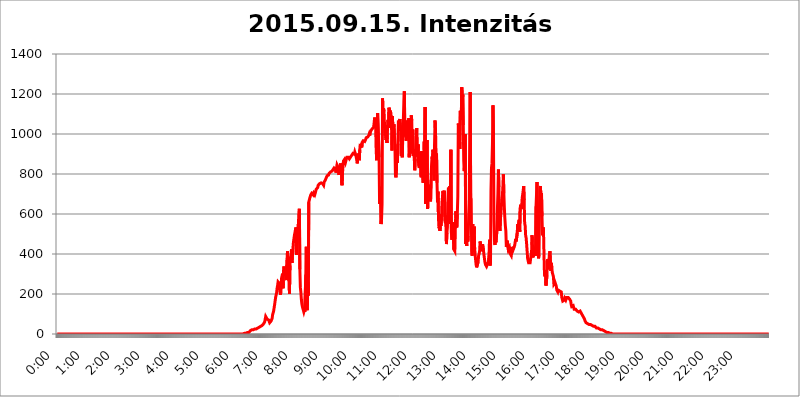
| Category | 2015.09.15. Intenzitás [W/m^2] |
|---|---|
| 0.0 | 0 |
| 0.0006944444444444445 | 0 |
| 0.001388888888888889 | 0 |
| 0.0020833333333333333 | 0 |
| 0.002777777777777778 | 0 |
| 0.003472222222222222 | 0 |
| 0.004166666666666667 | 0 |
| 0.004861111111111111 | 0 |
| 0.005555555555555556 | 0 |
| 0.0062499999999999995 | 0 |
| 0.006944444444444444 | 0 |
| 0.007638888888888889 | 0 |
| 0.008333333333333333 | 0 |
| 0.009027777777777779 | 0 |
| 0.009722222222222222 | 0 |
| 0.010416666666666666 | 0 |
| 0.011111111111111112 | 0 |
| 0.011805555555555555 | 0 |
| 0.012499999999999999 | 0 |
| 0.013194444444444444 | 0 |
| 0.013888888888888888 | 0 |
| 0.014583333333333332 | 0 |
| 0.015277777777777777 | 0 |
| 0.015972222222222224 | 0 |
| 0.016666666666666666 | 0 |
| 0.017361111111111112 | 0 |
| 0.018055555555555557 | 0 |
| 0.01875 | 0 |
| 0.019444444444444445 | 0 |
| 0.02013888888888889 | 0 |
| 0.020833333333333332 | 0 |
| 0.02152777777777778 | 0 |
| 0.022222222222222223 | 0 |
| 0.02291666666666667 | 0 |
| 0.02361111111111111 | 0 |
| 0.024305555555555556 | 0 |
| 0.024999999999999998 | 0 |
| 0.025694444444444447 | 0 |
| 0.02638888888888889 | 0 |
| 0.027083333333333334 | 0 |
| 0.027777777777777776 | 0 |
| 0.02847222222222222 | 0 |
| 0.029166666666666664 | 0 |
| 0.029861111111111113 | 0 |
| 0.030555555555555555 | 0 |
| 0.03125 | 0 |
| 0.03194444444444445 | 0 |
| 0.03263888888888889 | 0 |
| 0.03333333333333333 | 0 |
| 0.034027777777777775 | 0 |
| 0.034722222222222224 | 0 |
| 0.035416666666666666 | 0 |
| 0.036111111111111115 | 0 |
| 0.03680555555555556 | 0 |
| 0.0375 | 0 |
| 0.03819444444444444 | 0 |
| 0.03888888888888889 | 0 |
| 0.03958333333333333 | 0 |
| 0.04027777777777778 | 0 |
| 0.04097222222222222 | 0 |
| 0.041666666666666664 | 0 |
| 0.042361111111111106 | 0 |
| 0.04305555555555556 | 0 |
| 0.043750000000000004 | 0 |
| 0.044444444444444446 | 0 |
| 0.04513888888888889 | 0 |
| 0.04583333333333334 | 0 |
| 0.04652777777777778 | 0 |
| 0.04722222222222222 | 0 |
| 0.04791666666666666 | 0 |
| 0.04861111111111111 | 0 |
| 0.049305555555555554 | 0 |
| 0.049999999999999996 | 0 |
| 0.05069444444444445 | 0 |
| 0.051388888888888894 | 0 |
| 0.052083333333333336 | 0 |
| 0.05277777777777778 | 0 |
| 0.05347222222222222 | 0 |
| 0.05416666666666667 | 0 |
| 0.05486111111111111 | 0 |
| 0.05555555555555555 | 0 |
| 0.05625 | 0 |
| 0.05694444444444444 | 0 |
| 0.057638888888888885 | 0 |
| 0.05833333333333333 | 0 |
| 0.05902777777777778 | 0 |
| 0.059722222222222225 | 0 |
| 0.06041666666666667 | 0 |
| 0.061111111111111116 | 0 |
| 0.06180555555555556 | 0 |
| 0.0625 | 0 |
| 0.06319444444444444 | 0 |
| 0.06388888888888888 | 0 |
| 0.06458333333333334 | 0 |
| 0.06527777777777778 | 0 |
| 0.06597222222222222 | 0 |
| 0.06666666666666667 | 0 |
| 0.06736111111111111 | 0 |
| 0.06805555555555555 | 0 |
| 0.06874999999999999 | 0 |
| 0.06944444444444443 | 0 |
| 0.07013888888888889 | 0 |
| 0.07083333333333333 | 0 |
| 0.07152777777777779 | 0 |
| 0.07222222222222223 | 0 |
| 0.07291666666666667 | 0 |
| 0.07361111111111111 | 0 |
| 0.07430555555555556 | 0 |
| 0.075 | 0 |
| 0.07569444444444444 | 0 |
| 0.0763888888888889 | 0 |
| 0.07708333333333334 | 0 |
| 0.07777777777777778 | 0 |
| 0.07847222222222222 | 0 |
| 0.07916666666666666 | 0 |
| 0.0798611111111111 | 0 |
| 0.08055555555555556 | 0 |
| 0.08125 | 0 |
| 0.08194444444444444 | 0 |
| 0.08263888888888889 | 0 |
| 0.08333333333333333 | 0 |
| 0.08402777777777777 | 0 |
| 0.08472222222222221 | 0 |
| 0.08541666666666665 | 0 |
| 0.08611111111111112 | 0 |
| 0.08680555555555557 | 0 |
| 0.08750000000000001 | 0 |
| 0.08819444444444445 | 0 |
| 0.08888888888888889 | 0 |
| 0.08958333333333333 | 0 |
| 0.09027777777777778 | 0 |
| 0.09097222222222222 | 0 |
| 0.09166666666666667 | 0 |
| 0.09236111111111112 | 0 |
| 0.09305555555555556 | 0 |
| 0.09375 | 0 |
| 0.09444444444444444 | 0 |
| 0.09513888888888888 | 0 |
| 0.09583333333333333 | 0 |
| 0.09652777777777777 | 0 |
| 0.09722222222222222 | 0 |
| 0.09791666666666667 | 0 |
| 0.09861111111111111 | 0 |
| 0.09930555555555555 | 0 |
| 0.09999999999999999 | 0 |
| 0.10069444444444443 | 0 |
| 0.1013888888888889 | 0 |
| 0.10208333333333335 | 0 |
| 0.10277777777777779 | 0 |
| 0.10347222222222223 | 0 |
| 0.10416666666666667 | 0 |
| 0.10486111111111111 | 0 |
| 0.10555555555555556 | 0 |
| 0.10625 | 0 |
| 0.10694444444444444 | 0 |
| 0.1076388888888889 | 0 |
| 0.10833333333333334 | 0 |
| 0.10902777777777778 | 0 |
| 0.10972222222222222 | 0 |
| 0.1111111111111111 | 0 |
| 0.11180555555555556 | 0 |
| 0.11180555555555556 | 0 |
| 0.1125 | 0 |
| 0.11319444444444444 | 0 |
| 0.11388888888888889 | 0 |
| 0.11458333333333333 | 0 |
| 0.11527777777777777 | 0 |
| 0.11597222222222221 | 0 |
| 0.11666666666666665 | 0 |
| 0.1173611111111111 | 0 |
| 0.11805555555555557 | 0 |
| 0.11944444444444445 | 0 |
| 0.12013888888888889 | 0 |
| 0.12083333333333333 | 0 |
| 0.12152777777777778 | 0 |
| 0.12222222222222223 | 0 |
| 0.12291666666666667 | 0 |
| 0.12291666666666667 | 0 |
| 0.12361111111111112 | 0 |
| 0.12430555555555556 | 0 |
| 0.125 | 0 |
| 0.12569444444444444 | 0 |
| 0.12638888888888888 | 0 |
| 0.12708333333333333 | 0 |
| 0.16875 | 0 |
| 0.12847222222222224 | 0 |
| 0.12916666666666668 | 0 |
| 0.12986111111111112 | 0 |
| 0.13055555555555556 | 0 |
| 0.13125 | 0 |
| 0.13194444444444445 | 0 |
| 0.1326388888888889 | 0 |
| 0.13333333333333333 | 0 |
| 0.13402777777777777 | 0 |
| 0.13402777777777777 | 0 |
| 0.13472222222222222 | 0 |
| 0.13541666666666666 | 0 |
| 0.1361111111111111 | 0 |
| 0.13749999999999998 | 0 |
| 0.13819444444444443 | 0 |
| 0.1388888888888889 | 0 |
| 0.13958333333333334 | 0 |
| 0.14027777777777778 | 0 |
| 0.14097222222222222 | 0 |
| 0.14166666666666666 | 0 |
| 0.1423611111111111 | 0 |
| 0.14305555555555557 | 0 |
| 0.14375000000000002 | 0 |
| 0.14444444444444446 | 0 |
| 0.1451388888888889 | 0 |
| 0.1451388888888889 | 0 |
| 0.14652777777777778 | 0 |
| 0.14722222222222223 | 0 |
| 0.14791666666666667 | 0 |
| 0.1486111111111111 | 0 |
| 0.14930555555555555 | 0 |
| 0.15 | 0 |
| 0.15069444444444444 | 0 |
| 0.15138888888888888 | 0 |
| 0.15208333333333332 | 0 |
| 0.15277777777777776 | 0 |
| 0.15347222222222223 | 0 |
| 0.15416666666666667 | 0 |
| 0.15486111111111112 | 0 |
| 0.15555555555555556 | 0 |
| 0.15625 | 0 |
| 0.15694444444444444 | 0 |
| 0.15763888888888888 | 0 |
| 0.15833333333333333 | 0 |
| 0.15902777777777777 | 0 |
| 0.15972222222222224 | 0 |
| 0.16041666666666668 | 0 |
| 0.16111111111111112 | 0 |
| 0.16180555555555556 | 0 |
| 0.1625 | 0 |
| 0.16319444444444445 | 0 |
| 0.1638888888888889 | 0 |
| 0.16458333333333333 | 0 |
| 0.16527777777777777 | 0 |
| 0.16597222222222222 | 0 |
| 0.16666666666666666 | 0 |
| 0.1673611111111111 | 0 |
| 0.16805555555555554 | 0 |
| 0.16874999999999998 | 0 |
| 0.16944444444444443 | 0 |
| 0.17013888888888887 | 0 |
| 0.1708333333333333 | 0 |
| 0.17152777777777775 | 0 |
| 0.17222222222222225 | 0 |
| 0.1729166666666667 | 0 |
| 0.17361111111111113 | 0 |
| 0.17430555555555557 | 0 |
| 0.17500000000000002 | 0 |
| 0.17569444444444446 | 0 |
| 0.1763888888888889 | 0 |
| 0.17708333333333334 | 0 |
| 0.17777777777777778 | 0 |
| 0.17847222222222223 | 0 |
| 0.17916666666666667 | 0 |
| 0.1798611111111111 | 0 |
| 0.18055555555555555 | 0 |
| 0.18125 | 0 |
| 0.18194444444444444 | 0 |
| 0.1826388888888889 | 0 |
| 0.18333333333333335 | 0 |
| 0.1840277777777778 | 0 |
| 0.18472222222222223 | 0 |
| 0.18541666666666667 | 0 |
| 0.18611111111111112 | 0 |
| 0.18680555555555556 | 0 |
| 0.1875 | 0 |
| 0.18819444444444444 | 0 |
| 0.18888888888888888 | 0 |
| 0.18958333333333333 | 0 |
| 0.19027777777777777 | 0 |
| 0.1909722222222222 | 0 |
| 0.19166666666666665 | 0 |
| 0.19236111111111112 | 0 |
| 0.19305555555555554 | 0 |
| 0.19375 | 0 |
| 0.19444444444444445 | 0 |
| 0.1951388888888889 | 0 |
| 0.19583333333333333 | 0 |
| 0.19652777777777777 | 0 |
| 0.19722222222222222 | 0 |
| 0.19791666666666666 | 0 |
| 0.1986111111111111 | 0 |
| 0.19930555555555554 | 0 |
| 0.19999999999999998 | 0 |
| 0.20069444444444443 | 0 |
| 0.20138888888888887 | 0 |
| 0.2020833333333333 | 0 |
| 0.2027777777777778 | 0 |
| 0.2034722222222222 | 0 |
| 0.2041666666666667 | 0 |
| 0.20486111111111113 | 0 |
| 0.20555555555555557 | 0 |
| 0.20625000000000002 | 0 |
| 0.20694444444444446 | 0 |
| 0.2076388888888889 | 0 |
| 0.20833333333333334 | 0 |
| 0.20902777777777778 | 0 |
| 0.20972222222222223 | 0 |
| 0.21041666666666667 | 0 |
| 0.2111111111111111 | 0 |
| 0.21180555555555555 | 0 |
| 0.2125 | 0 |
| 0.21319444444444444 | 0 |
| 0.2138888888888889 | 0 |
| 0.21458333333333335 | 0 |
| 0.2152777777777778 | 0 |
| 0.21597222222222223 | 0 |
| 0.21666666666666667 | 0 |
| 0.21736111111111112 | 0 |
| 0.21805555555555556 | 0 |
| 0.21875 | 0 |
| 0.21944444444444444 | 0 |
| 0.22013888888888888 | 0 |
| 0.22083333333333333 | 0 |
| 0.22152777777777777 | 0 |
| 0.2222222222222222 | 0 |
| 0.22291666666666665 | 0 |
| 0.2236111111111111 | 0 |
| 0.22430555555555556 | 0 |
| 0.225 | 0 |
| 0.22569444444444445 | 0 |
| 0.2263888888888889 | 0 |
| 0.22708333333333333 | 0 |
| 0.22777777777777777 | 0 |
| 0.22847222222222222 | 0 |
| 0.22916666666666666 | 0 |
| 0.2298611111111111 | 0 |
| 0.23055555555555554 | 0 |
| 0.23124999999999998 | 0 |
| 0.23194444444444443 | 0 |
| 0.23263888888888887 | 0 |
| 0.2333333333333333 | 0 |
| 0.2340277777777778 | 0 |
| 0.2347222222222222 | 0 |
| 0.2354166666666667 | 0 |
| 0.23611111111111113 | 0 |
| 0.23680555555555557 | 0 |
| 0.23750000000000002 | 0 |
| 0.23819444444444446 | 0 |
| 0.2388888888888889 | 0 |
| 0.23958333333333334 | 0 |
| 0.24027777777777778 | 0 |
| 0.24097222222222223 | 0 |
| 0.24166666666666667 | 0 |
| 0.2423611111111111 | 0 |
| 0.24305555555555555 | 0 |
| 0.24375 | 0 |
| 0.24444444444444446 | 0 |
| 0.24513888888888888 | 0 |
| 0.24583333333333335 | 0 |
| 0.2465277777777778 | 0 |
| 0.24722222222222223 | 0 |
| 0.24791666666666667 | 0 |
| 0.24861111111111112 | 0 |
| 0.24930555555555556 | 0 |
| 0.25 | 0 |
| 0.25069444444444444 | 0 |
| 0.2513888888888889 | 0 |
| 0.2520833333333333 | 0 |
| 0.25277777777777777 | 0 |
| 0.2534722222222222 | 0 |
| 0.25416666666666665 | 0 |
| 0.2548611111111111 | 0 |
| 0.2555555555555556 | 0 |
| 0.25625000000000003 | 0 |
| 0.2569444444444445 | 0 |
| 0.2576388888888889 | 0 |
| 0.25833333333333336 | 0 |
| 0.2590277777777778 | 0 |
| 0.25972222222222224 | 0 |
| 0.2604166666666667 | 0 |
| 0.2611111111111111 | 0 |
| 0.26180555555555557 | 3.525 |
| 0.2625 | 3.525 |
| 0.26319444444444445 | 3.525 |
| 0.2638888888888889 | 3.525 |
| 0.26458333333333334 | 3.525 |
| 0.2652777777777778 | 3.525 |
| 0.2659722222222222 | 3.525 |
| 0.26666666666666666 | 7.887 |
| 0.2673611111111111 | 7.887 |
| 0.26805555555555555 | 7.887 |
| 0.26875 | 7.887 |
| 0.26944444444444443 | 12.257 |
| 0.2701388888888889 | 12.257 |
| 0.2708333333333333 | 16.636 |
| 0.27152777777777776 | 16.636 |
| 0.2722222222222222 | 16.636 |
| 0.27291666666666664 | 21.024 |
| 0.2736111111111111 | 21.024 |
| 0.2743055555555555 | 21.024 |
| 0.27499999999999997 | 21.024 |
| 0.27569444444444446 | 21.024 |
| 0.27638888888888885 | 25.419 |
| 0.27708333333333335 | 25.419 |
| 0.2777777777777778 | 25.419 |
| 0.27847222222222223 | 25.419 |
| 0.2791666666666667 | 25.419 |
| 0.2798611111111111 | 29.823 |
| 0.28055555555555556 | 29.823 |
| 0.28125 | 29.823 |
| 0.28194444444444444 | 29.823 |
| 0.2826388888888889 | 29.823 |
| 0.2833333333333333 | 34.234 |
| 0.28402777777777777 | 34.234 |
| 0.2847222222222222 | 34.234 |
| 0.28541666666666665 | 38.653 |
| 0.28611111111111115 | 38.653 |
| 0.28680555555555554 | 38.653 |
| 0.28750000000000003 | 43.079 |
| 0.2881944444444445 | 47.511 |
| 0.2888888888888889 | 47.511 |
| 0.28958333333333336 | 51.951 |
| 0.2902777777777778 | 56.398 |
| 0.29097222222222224 | 60.85 |
| 0.2916666666666667 | 65.31 |
| 0.2923611111111111 | 87.692 |
| 0.29305555555555557 | 92.184 |
| 0.29375 | 87.692 |
| 0.29444444444444445 | 74.246 |
| 0.2951388888888889 | 69.775 |
| 0.29583333333333334 | 78.722 |
| 0.2965277777777778 | 69.775 |
| 0.2972222222222222 | 65.31 |
| 0.29791666666666666 | 56.398 |
| 0.2986111111111111 | 60.85 |
| 0.29930555555555555 | 60.85 |
| 0.3 | 65.31 |
| 0.30069444444444443 | 69.775 |
| 0.3013888888888889 | 78.722 |
| 0.3020833333333333 | 96.682 |
| 0.30277777777777776 | 101.184 |
| 0.3034722222222222 | 114.716 |
| 0.30416666666666664 | 119.235 |
| 0.3048611111111111 | 146.423 |
| 0.3055555555555555 | 164.605 |
| 0.30624999999999997 | 182.82 |
| 0.3069444444444444 | 187.378 |
| 0.3076388888888889 | 205.62 |
| 0.30833333333333335 | 228.436 |
| 0.3090277777777778 | 242.127 |
| 0.30972222222222223 | 260.373 |
| 0.3104166666666667 | 264.932 |
| 0.3111111111111111 | 264.932 |
| 0.31180555555555556 | 251.251 |
| 0.3125 | 210.182 |
| 0.31319444444444444 | 196.497 |
| 0.3138888888888889 | 201.058 |
| 0.3145833333333333 | 278.603 |
| 0.31527777777777777 | 283.156 |
| 0.3159722222222222 | 301.354 |
| 0.31666666666666665 | 228.436 |
| 0.31736111111111115 | 314.98 |
| 0.31805555555555554 | 337.639 |
| 0.31875000000000003 | 310.44 |
| 0.3194444444444445 | 314.98 |
| 0.3201388888888889 | 292.259 |
| 0.32083333333333336 | 305.898 |
| 0.3215277777777778 | 269.49 |
| 0.32222222222222224 | 369.23 |
| 0.3229166666666667 | 414.035 |
| 0.3236111111111111 | 409.574 |
| 0.32430555555555557 | 269.49 |
| 0.325 | 292.259 |
| 0.32569444444444445 | 201.058 |
| 0.3263888888888889 | 342.162 |
| 0.32708333333333334 | 382.715 |
| 0.3277777777777778 | 391.685 |
| 0.3284722222222222 | 422.943 |
| 0.32916666666666666 | 355.712 |
| 0.3298611111111111 | 396.164 |
| 0.33055555555555555 | 400.638 |
| 0.33125 | 458.38 |
| 0.33194444444444443 | 475.972 |
| 0.3326388888888889 | 493.475 |
| 0.3333333333333333 | 506.542 |
| 0.3340277777777778 | 510.885 |
| 0.3347222222222222 | 532.513 |
| 0.3354166666666667 | 396.164 |
| 0.3361111111111111 | 523.88 |
| 0.3368055555555556 | 532.513 |
| 0.33749999999999997 | 515.223 |
| 0.33819444444444446 | 549.704 |
| 0.33888888888888885 | 600.661 |
| 0.33958333333333335 | 625.784 |
| 0.34027777777777773 | 324.052 |
| 0.34097222222222223 | 233 |
| 0.3416666666666666 | 210.182 |
| 0.3423611111111111 | 173.709 |
| 0.3430555555555555 | 150.964 |
| 0.34375 | 137.347 |
| 0.3444444444444445 | 128.284 |
| 0.3451388888888889 | 119.235 |
| 0.3458333333333334 | 110.201 |
| 0.34652777777777777 | 119.235 |
| 0.34722222222222227 | 110.201 |
| 0.34791666666666665 | 114.716 |
| 0.34861111111111115 | 296.808 |
| 0.34930555555555554 | 436.27 |
| 0.35000000000000003 | 132.814 |
| 0.3506944444444444 | 119.235 |
| 0.3513888888888889 | 260.373 |
| 0.3520833333333333 | 191.937 |
| 0.3527777777777778 | 658.909 |
| 0.3534722222222222 | 663.019 |
| 0.3541666666666667 | 679.395 |
| 0.3548611111111111 | 687.544 |
| 0.35555555555555557 | 695.666 |
| 0.35625 | 699.717 |
| 0.35694444444444445 | 703.762 |
| 0.3576388888888889 | 699.717 |
| 0.35833333333333334 | 703.762 |
| 0.3590277777777778 | 695.666 |
| 0.3597222222222222 | 703.762 |
| 0.36041666666666666 | 707.8 |
| 0.3611111111111111 | 695.666 |
| 0.36180555555555555 | 703.762 |
| 0.3625 | 703.762 |
| 0.36319444444444443 | 723.889 |
| 0.3638888888888889 | 727.896 |
| 0.3645833333333333 | 727.896 |
| 0.3652777777777778 | 731.896 |
| 0.3659722222222222 | 743.859 |
| 0.3666666666666667 | 747.834 |
| 0.3673611111111111 | 747.834 |
| 0.3680555555555556 | 751.803 |
| 0.36874999999999997 | 747.834 |
| 0.36944444444444446 | 751.803 |
| 0.37013888888888885 | 755.766 |
| 0.37083333333333335 | 751.803 |
| 0.37152777777777773 | 751.803 |
| 0.37222222222222223 | 751.803 |
| 0.3729166666666666 | 747.834 |
| 0.3736111111111111 | 743.859 |
| 0.3743055555555555 | 759.723 |
| 0.375 | 759.723 |
| 0.3756944444444445 | 767.62 |
| 0.3763888888888889 | 767.62 |
| 0.3770833333333334 | 779.42 |
| 0.37777777777777777 | 779.42 |
| 0.37847222222222227 | 791.169 |
| 0.37916666666666665 | 791.169 |
| 0.37986111111111115 | 791.169 |
| 0.38055555555555554 | 795.074 |
| 0.38125000000000003 | 802.868 |
| 0.3819444444444444 | 802.868 |
| 0.3826388888888889 | 806.757 |
| 0.3833333333333333 | 810.641 |
| 0.3840277777777778 | 814.519 |
| 0.3847222222222222 | 814.519 |
| 0.3854166666666667 | 814.519 |
| 0.3861111111111111 | 818.392 |
| 0.38680555555555557 | 822.26 |
| 0.3875 | 826.123 |
| 0.38819444444444445 | 829.981 |
| 0.3888888888888889 | 829.981 |
| 0.38958333333333334 | 826.123 |
| 0.3902777777777778 | 822.26 |
| 0.3909722222222222 | 806.757 |
| 0.39166666666666666 | 829.981 |
| 0.3923611111111111 | 845.365 |
| 0.39305555555555555 | 841.526 |
| 0.39375 | 833.834 |
| 0.39444444444444443 | 829.981 |
| 0.3951388888888889 | 795.074 |
| 0.3958333333333333 | 826.123 |
| 0.3965277777777778 | 837.682 |
| 0.3972222222222222 | 853.029 |
| 0.3979166666666667 | 822.26 |
| 0.3986111111111111 | 829.981 |
| 0.3993055555555556 | 743.859 |
| 0.39999999999999997 | 802.868 |
| 0.40069444444444446 | 806.757 |
| 0.40138888888888885 | 864.493 |
| 0.40208333333333335 | 868.305 |
| 0.40277777777777773 | 872.114 |
| 0.40347222222222223 | 864.493 |
| 0.4041666666666666 | 856.855 |
| 0.4048611111111111 | 860.676 |
| 0.4055555555555555 | 875.918 |
| 0.40625 | 883.516 |
| 0.4069444444444445 | 883.516 |
| 0.4076388888888889 | 883.516 |
| 0.4083333333333334 | 883.516 |
| 0.40902777777777777 | 883.516 |
| 0.40972222222222227 | 875.918 |
| 0.41041666666666665 | 879.719 |
| 0.41111111111111115 | 883.516 |
| 0.41180555555555554 | 887.309 |
| 0.41250000000000003 | 891.099 |
| 0.4131944444444444 | 894.885 |
| 0.4138888888888889 | 894.885 |
| 0.4145833333333333 | 902.447 |
| 0.4152777777777778 | 906.223 |
| 0.4159722222222222 | 906.223 |
| 0.4166666666666667 | 898.668 |
| 0.4173611111111111 | 909.996 |
| 0.41805555555555557 | 913.766 |
| 0.41875 | 894.885 |
| 0.41944444444444445 | 891.099 |
| 0.4201388888888889 | 868.305 |
| 0.42083333333333334 | 853.029 |
| 0.4215277777777778 | 887.309 |
| 0.4222222222222222 | 902.447 |
| 0.42291666666666666 | 883.516 |
| 0.4236111111111111 | 868.305 |
| 0.42430555555555555 | 921.298 |
| 0.425 | 951.327 |
| 0.42569444444444443 | 955.071 |
| 0.4263888888888889 | 951.327 |
| 0.4270833333333333 | 932.576 |
| 0.4277777777777778 | 958.814 |
| 0.4284722222222222 | 962.555 |
| 0.4291666666666667 | 966.295 |
| 0.4298611111111111 | 970.034 |
| 0.4305555555555556 | 970.034 |
| 0.43124999999999997 | 962.555 |
| 0.43194444444444446 | 962.555 |
| 0.43263888888888885 | 973.772 |
| 0.43333333333333335 | 981.244 |
| 0.43402777777777773 | 981.244 |
| 0.43472222222222223 | 984.98 |
| 0.4354166666666666 | 984.98 |
| 0.4361111111111111 | 988.714 |
| 0.4368055555555555 | 992.448 |
| 0.4375 | 999.916 |
| 0.4381944444444445 | 992.448 |
| 0.4388888888888889 | 1007.383 |
| 0.4395833333333334 | 1011.118 |
| 0.44027777777777777 | 1018.587 |
| 0.44097222222222227 | 1022.323 |
| 0.44166666666666665 | 1026.06 |
| 0.44236111111111115 | 1026.06 |
| 0.44305555555555554 | 1026.06 |
| 0.44375000000000003 | 1033.537 |
| 0.4444444444444444 | 1056.004 |
| 0.4451388888888889 | 1082.324 |
| 0.4458333333333333 | 1048.508 |
| 0.4465277777777778 | 1041.019 |
| 0.4472222222222222 | 932.576 |
| 0.4479166666666667 | 868.305 |
| 0.4486111111111111 | 996.182 |
| 0.44930555555555557 | 1105.019 |
| 0.45 | 1105.019 |
| 0.45069444444444445 | 1101.226 |
| 0.4513888888888889 | 883.516 |
| 0.45208333333333334 | 650.667 |
| 0.4527777777777778 | 663.019 |
| 0.4534722222222222 | 735.89 |
| 0.45416666666666666 | 549.704 |
| 0.4548611111111111 | 575.299 |
| 0.45555555555555555 | 650.667 |
| 0.45625 | 1178.177 |
| 0.45694444444444443 | 1101.226 |
| 0.4576388888888889 | 1127.879 |
| 0.4583333333333333 | 1112.618 |
| 0.4590277777777778 | 1037.277 |
| 0.4597222222222222 | 992.448 |
| 0.4604166666666667 | 1003.65 |
| 0.4611111111111111 | 970.034 |
| 0.4618055555555556 | 988.714 |
| 0.46249999999999997 | 955.071 |
| 0.46319444444444446 | 1037.277 |
| 0.46388888888888885 | 1071.027 |
| 0.46458333333333335 | 1029.798 |
| 0.46527777777777773 | 1131.708 |
| 0.46597222222222223 | 1120.238 |
| 0.4666666666666666 | 1037.277 |
| 0.4673611111111111 | 1116.426 |
| 0.4680555555555555 | 1089.873 |
| 0.46875 | 1071.027 |
| 0.4694444444444445 | 917.534 |
| 0.4701388888888889 | 1089.873 |
| 0.4708333333333334 | 1007.383 |
| 0.47152777777777777 | 1007.383 |
| 0.47222222222222227 | 1048.508 |
| 0.47291666666666665 | 992.448 |
| 0.47361111111111115 | 943.832 |
| 0.47430555555555554 | 795.074 |
| 0.47500000000000003 | 783.342 |
| 0.4756944444444444 | 818.392 |
| 0.4763888888888889 | 921.298 |
| 0.4770833333333333 | 856.855 |
| 0.4777777777777778 | 951.327 |
| 0.4784722222222222 | 1067.267 |
| 0.4791666666666667 | 1052.255 |
| 0.4798611111111111 | 1052.255 |
| 0.48055555555555557 | 1074.789 |
| 0.48125 | 1014.852 |
| 0.48194444444444445 | 1037.277 |
| 0.4826388888888889 | 891.099 |
| 0.48333333333333334 | 917.534 |
| 0.4840277777777778 | 883.516 |
| 0.4847222222222222 | 1056.004 |
| 0.48541666666666666 | 1071.027 |
| 0.4861111111111111 | 1158.689 |
| 0.48680555555555555 | 1213.804 |
| 0.4875 | 1007.383 |
| 0.48819444444444443 | 1011.118 |
| 0.4888888888888889 | 981.244 |
| 0.4895833333333333 | 966.295 |
| 0.4902777777777778 | 1044.762 |
| 0.4909722222222222 | 1067.267 |
| 0.4916666666666667 | 999.916 |
| 0.4923611111111111 | 1003.65 |
| 0.4930555555555556 | 1078.555 |
| 0.49374999999999997 | 883.516 |
| 0.49444444444444446 | 988.714 |
| 0.49513888888888885 | 951.327 |
| 0.49583333333333335 | 977.508 |
| 0.49652777777777773 | 1093.653 |
| 0.49722222222222223 | 1067.267 |
| 0.4979166666666666 | 902.447 |
| 0.4986111111111111 | 1022.323 |
| 0.4993055555555555 | 891.099 |
| 0.5 | 921.298 |
| 0.5006944444444444 | 883.516 |
| 0.5013888888888889 | 818.392 |
| 0.5020833333333333 | 875.918 |
| 0.5027777777777778 | 925.06 |
| 0.5034722222222222 | 966.295 |
| 0.5041666666666667 | 1029.798 |
| 0.5048611111111111 | 887.309 |
| 0.5055555555555555 | 887.309 |
| 0.50625 | 947.58 |
| 0.5069444444444444 | 841.526 |
| 0.5076388888888889 | 829.981 |
| 0.5083333333333333 | 833.834 |
| 0.5090277777777777 | 845.365 |
| 0.5097222222222222 | 868.305 |
| 0.5104166666666666 | 783.342 |
| 0.5111111111111112 | 913.766 |
| 0.5118055555555555 | 814.519 |
| 0.5125000000000001 | 783.342 |
| 0.5131944444444444 | 755.766 |
| 0.513888888888889 | 841.526 |
| 0.5145833333333333 | 962.555 |
| 0.5152777777777778 | 875.918 |
| 0.5159722222222222 | 1135.543 |
| 0.5166666666666667 | 650.667 |
| 0.517361111111111 | 654.791 |
| 0.5180555555555556 | 841.526 |
| 0.5187499999999999 | 970.034 |
| 0.5194444444444445 | 625.784 |
| 0.5201388888888888 | 747.834 |
| 0.5208333333333334 | 679.395 |
| 0.5215277777777778 | 687.544 |
| 0.5222222222222223 | 743.859 |
| 0.5229166666666667 | 683.473 |
| 0.5236111111111111 | 663.019 |
| 0.5243055555555556 | 771.559 |
| 0.525 | 845.365 |
| 0.5256944444444445 | 887.309 |
| 0.5263888888888889 | 868.305 |
| 0.5270833333333333 | 921.298 |
| 0.5277777777777778 | 845.365 |
| 0.5284722222222222 | 767.62 |
| 0.5291666666666667 | 947.58 |
| 0.5298611111111111 | 1067.267 |
| 0.5305555555555556 | 1014.852 |
| 0.53125 | 891.099 |
| 0.5319444444444444 | 902.447 |
| 0.5326388888888889 | 755.766 |
| 0.5333333333333333 | 658.909 |
| 0.5340277777777778 | 711.832 |
| 0.5347222222222222 | 575.299 |
| 0.5354166666666667 | 528.2 |
| 0.5361111111111111 | 536.82 |
| 0.5368055555555555 | 515.223 |
| 0.5375 | 553.986 |
| 0.5381944444444444 | 541.121 |
| 0.5388888888888889 | 575.299 |
| 0.5395833333333333 | 654.791 |
| 0.5402777777777777 | 650.667 |
| 0.5409722222222222 | 715.858 |
| 0.5416666666666666 | 679.395 |
| 0.5423611111111112 | 663.019 |
| 0.5430555555555555 | 715.858 |
| 0.5437500000000001 | 566.793 |
| 0.5444444444444444 | 553.986 |
| 0.545138888888889 | 592.233 |
| 0.5458333333333333 | 449.551 |
| 0.5465277777777778 | 506.542 |
| 0.5472222222222222 | 532.513 |
| 0.5479166666666667 | 667.123 |
| 0.548611111111111 | 731.896 |
| 0.5493055555555556 | 646.537 |
| 0.5499999999999999 | 675.311 |
| 0.5506944444444445 | 739.877 |
| 0.5513888888888888 | 549.704 |
| 0.5520833333333334 | 921.298 |
| 0.5527777777777778 | 506.542 |
| 0.5534722222222223 | 471.582 |
| 0.5541666666666667 | 558.261 |
| 0.5548611111111111 | 480.356 |
| 0.5555555555555556 | 489.108 |
| 0.55625 | 422.943 |
| 0.5569444444444445 | 422.943 |
| 0.5576388888888889 | 414.035 |
| 0.5583333333333333 | 519.555 |
| 0.5590277777777778 | 613.252 |
| 0.5597222222222222 | 558.261 |
| 0.5604166666666667 | 532.513 |
| 0.5611111111111111 | 600.661 |
| 0.5618055555555556 | 687.544 |
| 0.5625 | 1052.255 |
| 0.5631944444444444 | 1018.587 |
| 0.5638888888888889 | 1029.798 |
| 0.5645833333333333 | 925.06 |
| 0.5652777777777778 | 1116.426 |
| 0.5659722222222222 | 1105.019 |
| 0.5666666666666667 | 1071.027 |
| 0.5673611111111111 | 1233.951 |
| 0.5680555555555555 | 1158.689 |
| 0.56875 | 1197.876 |
| 0.5694444444444444 | 1044.762 |
| 0.5701388888888889 | 864.493 |
| 0.5708333333333333 | 814.519 |
| 0.5715277777777777 | 875.918 |
| 0.5722222222222222 | 999.916 |
| 0.5729166666666666 | 449.551 |
| 0.5736111111111112 | 471.582 |
| 0.5743055555555555 | 440.702 |
| 0.5750000000000001 | 541.121 |
| 0.5756944444444444 | 462.786 |
| 0.576388888888889 | 489.108 |
| 0.5770833333333333 | 592.233 |
| 0.5777777777777778 | 654.791 |
| 0.5784722222222222 | 958.814 |
| 0.5791666666666667 | 1209.807 |
| 0.579861111111111 | 683.473 |
| 0.5805555555555556 | 675.311 |
| 0.5812499999999999 | 414.035 |
| 0.5819444444444445 | 391.685 |
| 0.5826388888888888 | 549.704 |
| 0.5833333333333334 | 409.574 |
| 0.5840277777777778 | 414.035 |
| 0.5847222222222223 | 536.82 |
| 0.5854166666666667 | 427.39 |
| 0.5861111111111111 | 396.164 |
| 0.5868055555555556 | 369.23 |
| 0.5875 | 346.682 |
| 0.5881944444444445 | 333.113 |
| 0.5888888888888889 | 333.113 |
| 0.5895833333333333 | 337.639 |
| 0.5902777777777778 | 360.221 |
| 0.5909722222222222 | 391.685 |
| 0.5916666666666667 | 400.638 |
| 0.5923611111111111 | 414.035 |
| 0.5930555555555556 | 462.786 |
| 0.59375 | 449.551 |
| 0.5944444444444444 | 422.943 |
| 0.5951388888888889 | 440.702 |
| 0.5958333333333333 | 414.035 |
| 0.5965277777777778 | 449.551 |
| 0.5972222222222222 | 449.551 |
| 0.5979166666666667 | 414.035 |
| 0.5986111111111111 | 391.685 |
| 0.5993055555555555 | 373.729 |
| 0.6 | 355.712 |
| 0.6006944444444444 | 346.682 |
| 0.6013888888888889 | 342.162 |
| 0.6020833333333333 | 337.639 |
| 0.6027777777777777 | 337.639 |
| 0.6034722222222222 | 342.162 |
| 0.6041666666666666 | 355.712 |
| 0.6048611111111112 | 346.682 |
| 0.6055555555555555 | 391.685 |
| 0.6062500000000001 | 471.582 |
| 0.6069444444444444 | 342.162 |
| 0.607638888888889 | 360.221 |
| 0.6083333333333333 | 715.858 |
| 0.6090277777777778 | 829.981 |
| 0.6097222222222222 | 853.029 |
| 0.6104166666666667 | 955.071 |
| 0.611111111111111 | 1143.232 |
| 0.6118055555555556 | 992.448 |
| 0.6124999999999999 | 566.793 |
| 0.6131944444444445 | 467.187 |
| 0.6138888888888888 | 445.129 |
| 0.6145833333333334 | 471.582 |
| 0.6152777777777778 | 458.38 |
| 0.6159722222222223 | 462.786 |
| 0.6166666666666667 | 519.555 |
| 0.6173611111111111 | 625.784 |
| 0.6180555555555556 | 703.762 |
| 0.61875 | 822.26 |
| 0.6194444444444445 | 735.89 |
| 0.6201388888888889 | 541.121 |
| 0.6208333333333333 | 515.223 |
| 0.6215277777777778 | 571.049 |
| 0.6222222222222222 | 600.661 |
| 0.6229166666666667 | 600.661 |
| 0.6236111111111111 | 675.311 |
| 0.6243055555555556 | 691.608 |
| 0.625 | 735.89 |
| 0.6256944444444444 | 798.974 |
| 0.6263888888888889 | 703.762 |
| 0.6270833333333333 | 629.948 |
| 0.6277777777777778 | 579.542 |
| 0.6284722222222222 | 541.121 |
| 0.6291666666666667 | 515.223 |
| 0.6298611111111111 | 436.27 |
| 0.6305555555555555 | 458.38 |
| 0.63125 | 467.187 |
| 0.6319444444444444 | 462.786 |
| 0.6326388888888889 | 422.943 |
| 0.6333333333333333 | 422.943 |
| 0.6340277777777777 | 431.833 |
| 0.6347222222222222 | 405.108 |
| 0.6354166666666666 | 405.108 |
| 0.6361111111111112 | 400.638 |
| 0.6368055555555555 | 391.685 |
| 0.6375000000000001 | 409.574 |
| 0.6381944444444444 | 436.27 |
| 0.638888888888889 | 436.27 |
| 0.6395833333333333 | 422.943 |
| 0.6402777777777778 | 427.39 |
| 0.6409722222222222 | 436.27 |
| 0.6416666666666667 | 445.129 |
| 0.642361111111111 | 462.786 |
| 0.6430555555555556 | 475.972 |
| 0.6437499999999999 | 462.786 |
| 0.6444444444444445 | 462.786 |
| 0.6451388888888888 | 506.542 |
| 0.6458333333333334 | 549.704 |
| 0.6465277777777778 | 528.2 |
| 0.6472222222222223 | 523.88 |
| 0.6479166666666667 | 571.049 |
| 0.6486111111111111 | 510.885 |
| 0.6493055555555556 | 629.948 |
| 0.65 | 646.537 |
| 0.6506944444444445 | 625.784 |
| 0.6513888888888889 | 638.256 |
| 0.6520833333333333 | 679.395 |
| 0.6527777777777778 | 679.395 |
| 0.6534722222222222 | 715.858 |
| 0.6541666666666667 | 739.877 |
| 0.6548611111111111 | 671.22 |
| 0.6555555555555556 | 553.986 |
| 0.65625 | 541.121 |
| 0.6569444444444444 | 493.475 |
| 0.6576388888888889 | 480.356 |
| 0.6583333333333333 | 449.551 |
| 0.6590277777777778 | 445.129 |
| 0.6597222222222222 | 378.224 |
| 0.6604166666666667 | 382.715 |
| 0.6611111111111111 | 355.712 |
| 0.6618055555555555 | 360.221 |
| 0.6625 | 351.198 |
| 0.6631944444444444 | 355.712 |
| 0.6638888888888889 | 351.198 |
| 0.6645833333333333 | 360.221 |
| 0.6652777777777777 | 414.035 |
| 0.6659722222222222 | 493.475 |
| 0.6666666666666666 | 414.035 |
| 0.6673611111111111 | 382.715 |
| 0.6680555555555556 | 414.035 |
| 0.6687500000000001 | 436.27 |
| 0.6694444444444444 | 440.702 |
| 0.6701388888888888 | 405.108 |
| 0.6708333333333334 | 391.685 |
| 0.6715277777777778 | 638.256 |
| 0.6722222222222222 | 638.256 |
| 0.6729166666666666 | 759.723 |
| 0.6736111111111112 | 475.972 |
| 0.6743055555555556 | 458.38 |
| 0.6749999999999999 | 378.224 |
| 0.6756944444444444 | 396.164 |
| 0.6763888888888889 | 629.948 |
| 0.6770833333333334 | 719.877 |
| 0.6777777777777777 | 739.877 |
| 0.6784722222222223 | 650.667 |
| 0.6791666666666667 | 703.762 |
| 0.6798611111111111 | 588.009 |
| 0.6805555555555555 | 493.475 |
| 0.68125 | 532.513 |
| 0.6819444444444445 | 523.88 |
| 0.6826388888888889 | 400.638 |
| 0.6833333333333332 | 301.354 |
| 0.6840277777777778 | 287.709 |
| 0.6847222222222222 | 319.517 |
| 0.6854166666666667 | 242.127 |
| 0.686111111111111 | 242.127 |
| 0.6868055555555556 | 292.259 |
| 0.6875 | 373.729 |
| 0.6881944444444444 | 324.052 |
| 0.688888888888889 | 328.584 |
| 0.6895833333333333 | 369.23 |
| 0.6902777777777778 | 396.164 |
| 0.6909722222222222 | 414.035 |
| 0.6916666666666668 | 364.728 |
| 0.6923611111111111 | 314.98 |
| 0.6930555555555555 | 355.712 |
| 0.69375 | 324.052 |
| 0.6944444444444445 | 305.898 |
| 0.6951388888888889 | 296.808 |
| 0.6958333333333333 | 287.709 |
| 0.6965277777777777 | 251.251 |
| 0.6972222222222223 | 255.813 |
| 0.6979166666666666 | 260.373 |
| 0.6986111111111111 | 260.373 |
| 0.6993055555555556 | 255.813 |
| 0.7000000000000001 | 237.564 |
| 0.7006944444444444 | 219.309 |
| 0.7013888888888888 | 223.873 |
| 0.7020833333333334 | 210.182 |
| 0.7027777777777778 | 219.309 |
| 0.7034722222222222 | 223.873 |
| 0.7041666666666666 | 223.873 |
| 0.7048611111111112 | 214.746 |
| 0.7055555555555556 | 210.182 |
| 0.7062499999999999 | 210.182 |
| 0.7069444444444444 | 210.182 |
| 0.7076388888888889 | 182.82 |
| 0.7083333333333334 | 173.709 |
| 0.7090277777777777 | 164.605 |
| 0.7097222222222223 | 160.056 |
| 0.7104166666666667 | 164.605 |
| 0.7111111111111111 | 169.156 |
| 0.7118055555555555 | 178.264 |
| 0.7125 | 173.709 |
| 0.7131944444444445 | 169.156 |
| 0.7138888888888889 | 173.709 |
| 0.7145833333333332 | 182.82 |
| 0.7152777777777778 | 178.264 |
| 0.7159722222222222 | 178.264 |
| 0.7166666666666667 | 182.82 |
| 0.717361111111111 | 187.378 |
| 0.7180555555555556 | 187.378 |
| 0.71875 | 173.709 |
| 0.7194444444444444 | 173.709 |
| 0.720138888888889 | 164.605 |
| 0.7208333333333333 | 146.423 |
| 0.7215277777777778 | 137.347 |
| 0.7222222222222222 | 137.347 |
| 0.7229166666666668 | 137.347 |
| 0.7236111111111111 | 141.884 |
| 0.7243055555555555 | 132.814 |
| 0.725 | 123.758 |
| 0.7256944444444445 | 123.758 |
| 0.7263888888888889 | 123.758 |
| 0.7270833333333333 | 123.758 |
| 0.7277777777777777 | 119.235 |
| 0.7284722222222223 | 119.235 |
| 0.7291666666666666 | 114.716 |
| 0.7298611111111111 | 110.201 |
| 0.7305555555555556 | 110.201 |
| 0.7312500000000001 | 110.201 |
| 0.7319444444444444 | 110.201 |
| 0.7326388888888888 | 110.201 |
| 0.7333333333333334 | 114.716 |
| 0.7340277777777778 | 110.201 |
| 0.7347222222222222 | 105.69 |
| 0.7354166666666666 | 101.184 |
| 0.7361111111111112 | 96.682 |
| 0.7368055555555556 | 92.184 |
| 0.7374999999999999 | 92.184 |
| 0.7381944444444444 | 83.205 |
| 0.7388888888888889 | 78.722 |
| 0.7395833333333334 | 74.246 |
| 0.7402777777777777 | 65.31 |
| 0.7409722222222223 | 60.85 |
| 0.7416666666666667 | 56.398 |
| 0.7423611111111111 | 56.398 |
| 0.7430555555555555 | 51.951 |
| 0.74375 | 51.951 |
| 0.7444444444444445 | 51.951 |
| 0.7451388888888889 | 47.511 |
| 0.7458333333333332 | 47.511 |
| 0.7465277777777778 | 47.511 |
| 0.7472222222222222 | 47.511 |
| 0.7479166666666667 | 47.511 |
| 0.748611111111111 | 47.511 |
| 0.7493055555555556 | 47.511 |
| 0.75 | 43.079 |
| 0.7506944444444444 | 43.079 |
| 0.751388888888889 | 43.079 |
| 0.7520833333333333 | 38.653 |
| 0.7527777777777778 | 38.653 |
| 0.7534722222222222 | 38.653 |
| 0.7541666666666668 | 38.653 |
| 0.7548611111111111 | 34.234 |
| 0.7555555555555555 | 34.234 |
| 0.75625 | 29.823 |
| 0.7569444444444445 | 29.823 |
| 0.7576388888888889 | 29.823 |
| 0.7583333333333333 | 29.823 |
| 0.7590277777777777 | 25.419 |
| 0.7597222222222223 | 25.419 |
| 0.7604166666666666 | 25.419 |
| 0.7611111111111111 | 25.419 |
| 0.7618055555555556 | 21.024 |
| 0.7625000000000001 | 21.024 |
| 0.7631944444444444 | 21.024 |
| 0.7638888888888888 | 21.024 |
| 0.7645833333333334 | 21.024 |
| 0.7652777777777778 | 16.636 |
| 0.7659722222222222 | 16.636 |
| 0.7666666666666666 | 16.636 |
| 0.7673611111111112 | 12.257 |
| 0.7680555555555556 | 12.257 |
| 0.7687499999999999 | 12.257 |
| 0.7694444444444444 | 12.257 |
| 0.7701388888888889 | 12.257 |
| 0.7708333333333334 | 7.887 |
| 0.7715277777777777 | 7.887 |
| 0.7722222222222223 | 7.887 |
| 0.7729166666666667 | 7.887 |
| 0.7736111111111111 | 3.525 |
| 0.7743055555555555 | 3.525 |
| 0.775 | 3.525 |
| 0.7756944444444445 | 3.525 |
| 0.7763888888888889 | 3.525 |
| 0.7770833333333332 | 3.525 |
| 0.7777777777777778 | 3.525 |
| 0.7784722222222222 | 0 |
| 0.7791666666666667 | 0 |
| 0.779861111111111 | 0 |
| 0.7805555555555556 | 0 |
| 0.78125 | 0 |
| 0.7819444444444444 | 0 |
| 0.782638888888889 | 0 |
| 0.7833333333333333 | 0 |
| 0.7840277777777778 | 0 |
| 0.7847222222222222 | 0 |
| 0.7854166666666668 | 0 |
| 0.7861111111111111 | 0 |
| 0.7868055555555555 | 0 |
| 0.7875 | 0 |
| 0.7881944444444445 | 0 |
| 0.7888888888888889 | 0 |
| 0.7895833333333333 | 0 |
| 0.7902777777777777 | 0 |
| 0.7909722222222223 | 0 |
| 0.7916666666666666 | 0 |
| 0.7923611111111111 | 0 |
| 0.7930555555555556 | 0 |
| 0.7937500000000001 | 0 |
| 0.7944444444444444 | 0 |
| 0.7951388888888888 | 0 |
| 0.7958333333333334 | 0 |
| 0.7965277777777778 | 0 |
| 0.7972222222222222 | 0 |
| 0.7979166666666666 | 0 |
| 0.7986111111111112 | 0 |
| 0.7993055555555556 | 0 |
| 0.7999999999999999 | 0 |
| 0.8006944444444444 | 0 |
| 0.8013888888888889 | 0 |
| 0.8020833333333334 | 0 |
| 0.8027777777777777 | 0 |
| 0.8034722222222223 | 0 |
| 0.8041666666666667 | 0 |
| 0.8048611111111111 | 0 |
| 0.8055555555555555 | 0 |
| 0.80625 | 0 |
| 0.8069444444444445 | 0 |
| 0.8076388888888889 | 0 |
| 0.8083333333333332 | 0 |
| 0.8090277777777778 | 0 |
| 0.8097222222222222 | 0 |
| 0.8104166666666667 | 0 |
| 0.811111111111111 | 0 |
| 0.8118055555555556 | 0 |
| 0.8125 | 0 |
| 0.8131944444444444 | 0 |
| 0.813888888888889 | 0 |
| 0.8145833333333333 | 0 |
| 0.8152777777777778 | 0 |
| 0.8159722222222222 | 0 |
| 0.8166666666666668 | 0 |
| 0.8173611111111111 | 0 |
| 0.8180555555555555 | 0 |
| 0.81875 | 0 |
| 0.8194444444444445 | 0 |
| 0.8201388888888889 | 0 |
| 0.8208333333333333 | 0 |
| 0.8215277777777777 | 0 |
| 0.8222222222222223 | 0 |
| 0.8229166666666666 | 0 |
| 0.8236111111111111 | 0 |
| 0.8243055555555556 | 0 |
| 0.8250000000000001 | 0 |
| 0.8256944444444444 | 0 |
| 0.8263888888888888 | 0 |
| 0.8270833333333334 | 0 |
| 0.8277777777777778 | 0 |
| 0.8284722222222222 | 0 |
| 0.8291666666666666 | 0 |
| 0.8298611111111112 | 0 |
| 0.8305555555555556 | 0 |
| 0.8312499999999999 | 0 |
| 0.8319444444444444 | 0 |
| 0.8326388888888889 | 0 |
| 0.8333333333333334 | 0 |
| 0.8340277777777777 | 0 |
| 0.8347222222222223 | 0 |
| 0.8354166666666667 | 0 |
| 0.8361111111111111 | 0 |
| 0.8368055555555555 | 0 |
| 0.8375 | 0 |
| 0.8381944444444445 | 0 |
| 0.8388888888888889 | 0 |
| 0.8395833333333332 | 0 |
| 0.8402777777777778 | 0 |
| 0.8409722222222222 | 0 |
| 0.8416666666666667 | 0 |
| 0.842361111111111 | 0 |
| 0.8430555555555556 | 0 |
| 0.84375 | 0 |
| 0.8444444444444444 | 0 |
| 0.845138888888889 | 0 |
| 0.8458333333333333 | 0 |
| 0.8465277777777778 | 0 |
| 0.8472222222222222 | 0 |
| 0.8479166666666668 | 0 |
| 0.8486111111111111 | 0 |
| 0.8493055555555555 | 0 |
| 0.85 | 0 |
| 0.8506944444444445 | 0 |
| 0.8513888888888889 | 0 |
| 0.8520833333333333 | 0 |
| 0.8527777777777777 | 0 |
| 0.8534722222222223 | 0 |
| 0.8541666666666666 | 0 |
| 0.8548611111111111 | 0 |
| 0.8555555555555556 | 0 |
| 0.8562500000000001 | 0 |
| 0.8569444444444444 | 0 |
| 0.8576388888888888 | 0 |
| 0.8583333333333334 | 0 |
| 0.8590277777777778 | 0 |
| 0.8597222222222222 | 0 |
| 0.8604166666666666 | 0 |
| 0.8611111111111112 | 0 |
| 0.8618055555555556 | 0 |
| 0.8624999999999999 | 0 |
| 0.8631944444444444 | 0 |
| 0.8638888888888889 | 0 |
| 0.8645833333333334 | 0 |
| 0.8652777777777777 | 0 |
| 0.8659722222222223 | 0 |
| 0.8666666666666667 | 0 |
| 0.8673611111111111 | 0 |
| 0.8680555555555555 | 0 |
| 0.86875 | 0 |
| 0.8694444444444445 | 0 |
| 0.8701388888888889 | 0 |
| 0.8708333333333332 | 0 |
| 0.8715277777777778 | 0 |
| 0.8722222222222222 | 0 |
| 0.8729166666666667 | 0 |
| 0.873611111111111 | 0 |
| 0.8743055555555556 | 0 |
| 0.875 | 0 |
| 0.8756944444444444 | 0 |
| 0.876388888888889 | 0 |
| 0.8770833333333333 | 0 |
| 0.8777777777777778 | 0 |
| 0.8784722222222222 | 0 |
| 0.8791666666666668 | 0 |
| 0.8798611111111111 | 0 |
| 0.8805555555555555 | 0 |
| 0.88125 | 0 |
| 0.8819444444444445 | 0 |
| 0.8826388888888889 | 0 |
| 0.8833333333333333 | 0 |
| 0.8840277777777777 | 0 |
| 0.8847222222222223 | 0 |
| 0.8854166666666666 | 0 |
| 0.8861111111111111 | 0 |
| 0.8868055555555556 | 0 |
| 0.8875000000000001 | 0 |
| 0.8881944444444444 | 0 |
| 0.8888888888888888 | 0 |
| 0.8895833333333334 | 0 |
| 0.8902777777777778 | 0 |
| 0.8909722222222222 | 0 |
| 0.8916666666666666 | 0 |
| 0.8923611111111112 | 0 |
| 0.8930555555555556 | 0 |
| 0.8937499999999999 | 0 |
| 0.8944444444444444 | 0 |
| 0.8951388888888889 | 0 |
| 0.8958333333333334 | 0 |
| 0.8965277777777777 | 0 |
| 0.8972222222222223 | 0 |
| 0.8979166666666667 | 0 |
| 0.8986111111111111 | 0 |
| 0.8993055555555555 | 0 |
| 0.9 | 0 |
| 0.9006944444444445 | 0 |
| 0.9013888888888889 | 0 |
| 0.9020833333333332 | 0 |
| 0.9027777777777778 | 0 |
| 0.9034722222222222 | 0 |
| 0.9041666666666667 | 0 |
| 0.904861111111111 | 0 |
| 0.9055555555555556 | 0 |
| 0.90625 | 0 |
| 0.9069444444444444 | 0 |
| 0.907638888888889 | 0 |
| 0.9083333333333333 | 0 |
| 0.9090277777777778 | 0 |
| 0.9097222222222222 | 0 |
| 0.9104166666666668 | 0 |
| 0.9111111111111111 | 0 |
| 0.9118055555555555 | 0 |
| 0.9125 | 0 |
| 0.9131944444444445 | 0 |
| 0.9138888888888889 | 0 |
| 0.9145833333333333 | 0 |
| 0.9152777777777777 | 0 |
| 0.9159722222222223 | 0 |
| 0.9166666666666666 | 0 |
| 0.9173611111111111 | 0 |
| 0.9180555555555556 | 0 |
| 0.9187500000000001 | 0 |
| 0.9194444444444444 | 0 |
| 0.9201388888888888 | 0 |
| 0.9208333333333334 | 0 |
| 0.9215277777777778 | 0 |
| 0.9222222222222222 | 0 |
| 0.9229166666666666 | 0 |
| 0.9236111111111112 | 0 |
| 0.9243055555555556 | 0 |
| 0.9249999999999999 | 0 |
| 0.9256944444444444 | 0 |
| 0.9263888888888889 | 0 |
| 0.9270833333333334 | 0 |
| 0.9277777777777777 | 0 |
| 0.9284722222222223 | 0 |
| 0.9291666666666667 | 0 |
| 0.9298611111111111 | 0 |
| 0.9305555555555555 | 0 |
| 0.93125 | 0 |
| 0.9319444444444445 | 0 |
| 0.9326388888888889 | 0 |
| 0.9333333333333332 | 0 |
| 0.9340277777777778 | 0 |
| 0.9347222222222222 | 0 |
| 0.9354166666666667 | 0 |
| 0.936111111111111 | 0 |
| 0.9368055555555556 | 0 |
| 0.9375 | 0 |
| 0.9381944444444444 | 0 |
| 0.938888888888889 | 0 |
| 0.9395833333333333 | 0 |
| 0.9402777777777778 | 0 |
| 0.9409722222222222 | 0 |
| 0.9416666666666668 | 0 |
| 0.9423611111111111 | 0 |
| 0.9430555555555555 | 0 |
| 0.94375 | 0 |
| 0.9444444444444445 | 0 |
| 0.9451388888888889 | 0 |
| 0.9458333333333333 | 0 |
| 0.9465277777777777 | 0 |
| 0.9472222222222223 | 0 |
| 0.9479166666666666 | 0 |
| 0.9486111111111111 | 0 |
| 0.9493055555555556 | 0 |
| 0.9500000000000001 | 0 |
| 0.9506944444444444 | 0 |
| 0.9513888888888888 | 0 |
| 0.9520833333333334 | 0 |
| 0.9527777777777778 | 0 |
| 0.9534722222222222 | 0 |
| 0.9541666666666666 | 0 |
| 0.9548611111111112 | 0 |
| 0.9555555555555556 | 0 |
| 0.9562499999999999 | 0 |
| 0.9569444444444444 | 0 |
| 0.9576388888888889 | 0 |
| 0.9583333333333334 | 0 |
| 0.9590277777777777 | 0 |
| 0.9597222222222223 | 0 |
| 0.9604166666666667 | 0 |
| 0.9611111111111111 | 0 |
| 0.9618055555555555 | 0 |
| 0.9625 | 0 |
| 0.9631944444444445 | 0 |
| 0.9638888888888889 | 0 |
| 0.9645833333333332 | 0 |
| 0.9652777777777778 | 0 |
| 0.9659722222222222 | 0 |
| 0.9666666666666667 | 0 |
| 0.967361111111111 | 0 |
| 0.9680555555555556 | 0 |
| 0.96875 | 0 |
| 0.9694444444444444 | 0 |
| 0.970138888888889 | 0 |
| 0.9708333333333333 | 0 |
| 0.9715277777777778 | 0 |
| 0.9722222222222222 | 0 |
| 0.9729166666666668 | 0 |
| 0.9736111111111111 | 0 |
| 0.9743055555555555 | 0 |
| 0.975 | 0 |
| 0.9756944444444445 | 0 |
| 0.9763888888888889 | 0 |
| 0.9770833333333333 | 0 |
| 0.9777777777777777 | 0 |
| 0.9784722222222223 | 0 |
| 0.9791666666666666 | 0 |
| 0.9798611111111111 | 0 |
| 0.9805555555555556 | 0 |
| 0.9812500000000001 | 0 |
| 0.9819444444444444 | 0 |
| 0.9826388888888888 | 0 |
| 0.9833333333333334 | 0 |
| 0.9840277777777778 | 0 |
| 0.9847222222222222 | 0 |
| 0.9854166666666666 | 0 |
| 0.9861111111111112 | 0 |
| 0.9868055555555556 | 0 |
| 0.9874999999999999 | 0 |
| 0.9881944444444444 | 0 |
| 0.9888888888888889 | 0 |
| 0.9895833333333334 | 0 |
| 0.9902777777777777 | 0 |
| 0.9909722222222223 | 0 |
| 0.9916666666666667 | 0 |
| 0.9923611111111111 | 0 |
| 0.9930555555555555 | 0 |
| 0.99375 | 0 |
| 0.9944444444444445 | 0 |
| 0.9951388888888889 | 0 |
| 0.9958333333333332 | 0 |
| 0.9965277777777778 | 0 |
| 0.9972222222222222 | 0 |
| 0.9979166666666667 | 0 |
| 0.998611111111111 | 0 |
| 0.9993055555555556 | 0 |